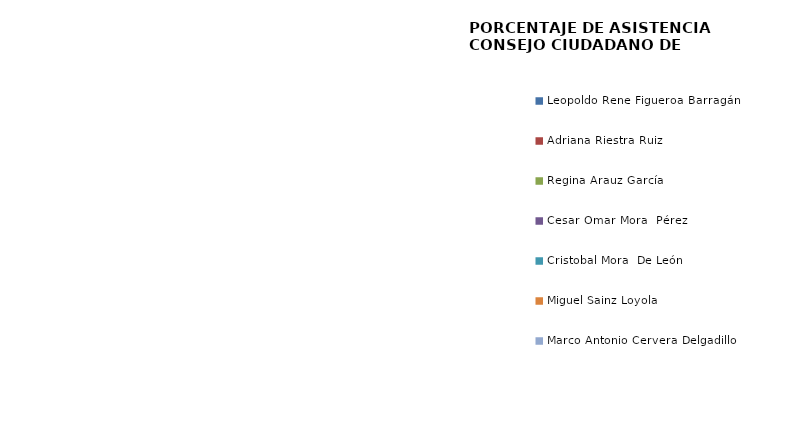
| Category | Series 0 |
|---|---|
| Leopoldo Rene Figueroa Barragán | 0 |
| Adriana Riestra Ruiz | 0 |
| Regina Arauz García | 0 |
| Cesar Omar Mora  Pérez | 0 |
| Cristobal Mora  De León | 0 |
| Miguel Sainz Loyola | 0 |
| Marco Antonio Cervera Delgadillo | 0 |